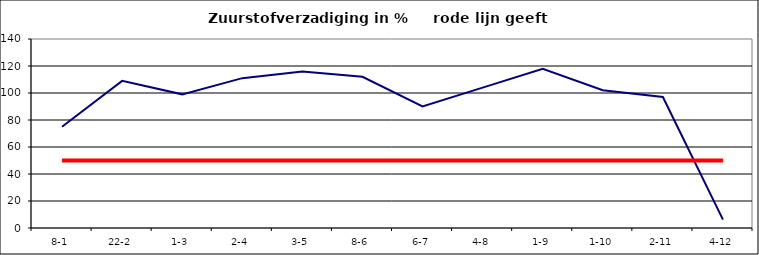
| Category | Series 0 | Series 1 |
|---|---|---|
| 8-1 | 75 | 50 |
| 22-2 | 109 | 50 |
| 1-3 | 99 | 50 |
| 2-4 | 111 | 50 |
| 3-5 | 116 | 50 |
| 8-6 | 112 | 50 |
| 6-7 | 90 | 50 |
| 4-8 | 104 | 50 |
| 1-9 | 118 | 50 |
| 1-10 | 102 | 50 |
| 2-11 | 97 | 50 |
| 4-12 | 6.2 | 50 |